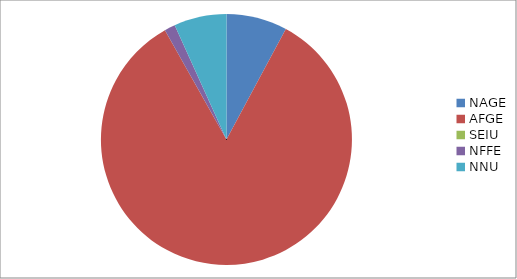
| Category | Series 0 |
|---|---|
| NAGE | 491 |
| AFGE | 5261 |
| SEIU | 0 |
| NFFE | 87 |
| NNU | 424 |